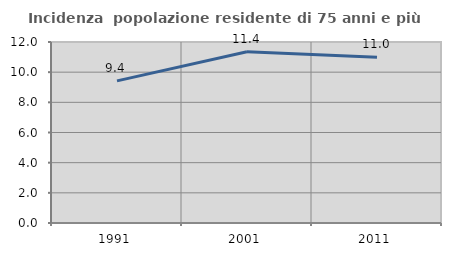
| Category | Incidenza  popolazione residente di 75 anni e più |
|---|---|
| 1991.0 | 9.424 |
| 2001.0 | 11.353 |
| 2011.0 | 10.988 |